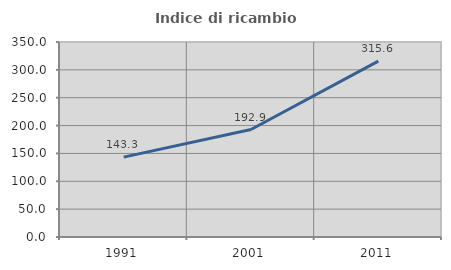
| Category | Indice di ricambio occupazionale  |
|---|---|
| 1991.0 | 143.333 |
| 2001.0 | 192.857 |
| 2011.0 | 315.556 |